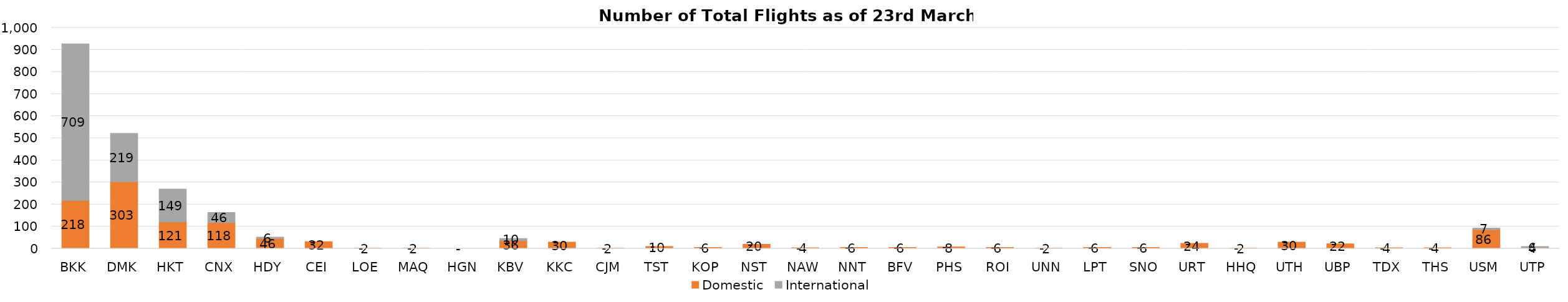
| Category | Domestic | International |
|---|---|---|
| BKK | 218 | 709 |
| DMK | 303 | 219 |
| HKT | 121 | 149 |
| CNX | 118 | 46 |
| HDY | 46 | 6 |
| CEI | 32 | 0 |
| LOE | 2 | 0 |
| MAQ | 2 | 0 |
| HGN | 0 | 0 |
| KBV | 36 | 10 |
| KKC | 30 | 0 |
| CJM | 2 | 0 |
| TST | 10 | 0 |
| KOP | 6 | 0 |
| NST | 20 | 0 |
| NAW | 4 | 0 |
| NNT | 6 | 0 |
| BFV | 6 | 0 |
| PHS | 8 | 0 |
| ROI | 6 | 0 |
| UNN | 2 | 0 |
| LPT | 6 | 0 |
| SNO | 6 | 0 |
| URT | 24 | 0 |
| HHQ | 2 | 0 |
| UTH | 30 | 0 |
| UBP | 22 | 0 |
| TDX | 4 | 0 |
| THS | 4 | 0 |
| USM | 86 | 7 |
| UTP | 4 | 6 |